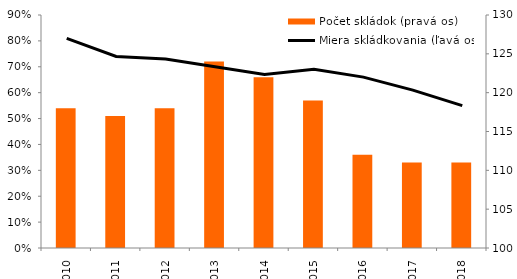
| Category | Počet skládok (pravá os) |
|---|---|
| 2010.0 | 118 |
| 2011.0 | 117 |
| 2012.0 | 118 |
| 2013.0 | 124 |
| 2014.0 | 122 |
| 2015.0 | 119 |
| 2016.0 | 112 |
| 2017.0 | 111 |